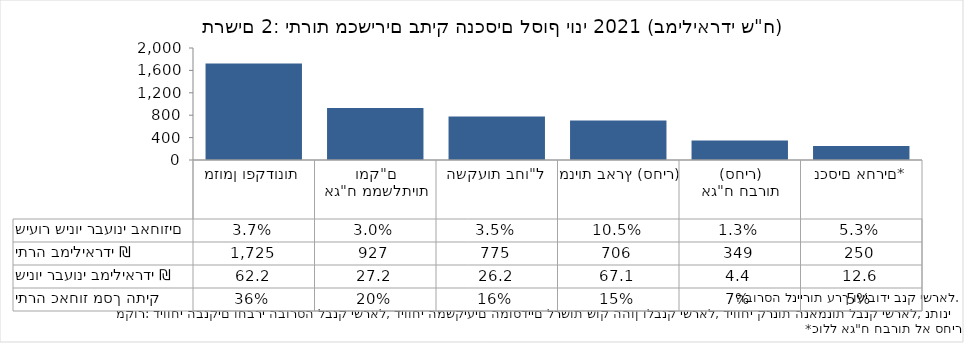
| Category | יתרה במיליארדי ₪   |
|---|---|
| מזומן ופקדונות | 1724.59 |
| אג"ח ממשלתיות ומק"ם | 927.47 |
| השקעות בחו"ל | 775.22 |
| מניות בארץ (סחיר) | 705.75 |
| אג"ח חברות
(סחיר) | 348.94 |
| נכסים אחרים* | 249.55 |